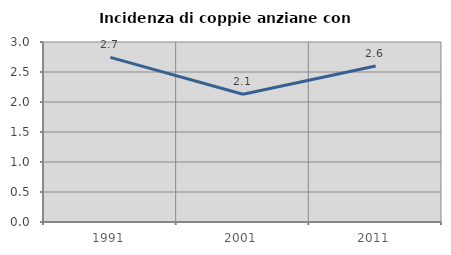
| Category | Incidenza di coppie anziane con figli |
|---|---|
| 1991.0 | 2.744 |
| 2001.0 | 2.129 |
| 2011.0 | 2.601 |